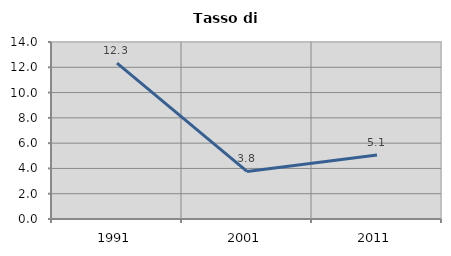
| Category | Tasso di disoccupazione   |
|---|---|
| 1991.0 | 12.329 |
| 2001.0 | 3.761 |
| 2011.0 | 5.065 |